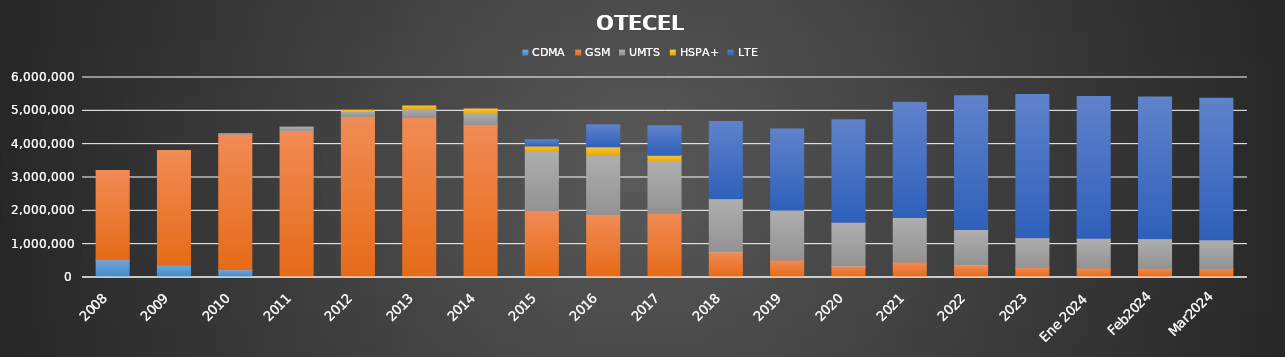
| Category | CDMA | GSM | UMTS | HSPA+ | LTE |
|---|---|---|---|---|---|
| 2008 | 533206 | 2678716 | 0 | 0 | 0 |
| 2009 | 370711 | 3435721 | 0 | 0 | 0 |
| 2010 | 232396 | 4061909 | 20294 | 0 | 0 |
| 2011 | 0 | 4403305 | 110569 | 0 | 0 |
| 2012 | 0 | 4823675 | 174375 | 21636 | 0 |
| 2013 | 0 | 4797632 | 272871 | 77805 | 0 |
| 2014 | 0 | 4589205 | 341647 | 124793 | 0 |
| 2015 | 0 | 2002436 | 1805322 | 136952 | 189988 |
| 2016 | 0 | 1881781 | 1787014 | 248541 | 662756 |
| 2017 | 0 | 1924184.634 | 1552693.066 | 187515.199 | 884631.101 |
| 2018 | 0 | 765658.891 | 1596404.415 | 0 | 2317582.694 |
| 2019 | 0 | 525011.505 | 1498097.705 | 0 | 2433246.79 |
| 2020 | 0 | 348601.621 | 1305745.099 | 0 | 3075378.28 |
| 2021 | 0 | 463116 | 1335075 | 0 | 3456277 |
| 2022 | 0 | 377030.536 | 1060440.283 | 0 | 4013644.181 |
| 2023 | 0 | 299210.551 | 896668.873 | 0 | 4293696.576 |
| Ene 2024 | 0 | 283602.743 | 890161.025 | 0 | 4253028.231 |
| Feb2024 | 0 | 281156.297 | 880092.083 | 0 | 4255374.62 |
| Mar2024 | 0 | 267820.732 | 857993.414 | 0 | 4255899.854 |